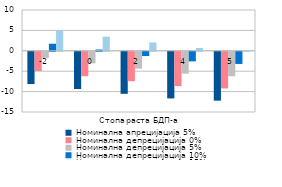
| Category | Номинална aпрецијација 5% | Номинална депрецијација 0% | Номинална депрецијација 5% | Номинална депрецијација 10% | Номинална депрецијација 15% |
|---|---|---|---|---|---|
| -2.0 | -7.905 | -4.694 | -1.482 | 1.73 | 4.942 |
| 0.0 | -9.126 | -5.978 | -2.831 | 0.317 | 3.465 |
| 2.0 | -10.298 | -7.213 | -4.127 | -1.041 | 2.045 |
| 4.0 | -11.426 | -8.399 | -5.373 | -2.346 | 0.68 |
| 5.0 | -11.974 | -8.976 | -5.978 | -2.981 | 0.017 |